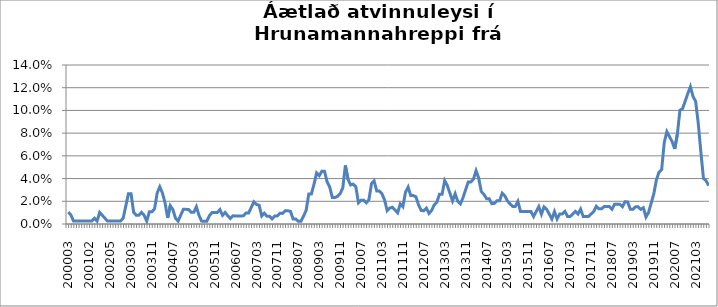
| Category | Series 0 |
|---|---|
| 200003 | 0.011 |
| 200004 | 0.008 |
| 200005 | 0.003 |
| 200007 | 0.003 |
| 200008 | 0.003 |
| 200011 | 0.003 |
| 200012 | 0.003 |
| 200101 | 0.003 |
| 200102 | 0.003 |
| 200103 | 0.003 |
| 200111 | 0.005 |
| 200112 | 0.003 |
| 200201 | 0.01 |
| 200202 | 0.008 |
| 200203 | 0.005 |
| 200204 | 0.003 |
| 200205 | 0.003 |
| 200206 | 0.003 |
| 200207 | 0.003 |
| 200208 | 0.003 |
| 200211 | 0.003 |
| 200212 | 0.005 |
| 200301 | 0.016 |
| 200302 | 0.027 |
| 200303 | 0.027 |
| 200304 | 0.01 |
| 200305 | 0.008 |
| 200306 | 0.008 |
| 200307 | 0.01 |
| 200308 | 0.008 |
| 200309 | 0.003 |
| 200310 | 0.011 |
| 200311 | 0.011 |
| 200312 | 0.013 |
| 200401 | 0.027 |
| 200402 | 0.033 |
| 200403 | 0.027 |
| 200404 | 0.019 |
| 200405 | 0.005 |
| 200406 | 0.016 |
| 200407 | 0.013 |
| 200408 | 0.005 |
| 200409 | 0.003 |
| 200410 | 0.008 |
| 200411 | 0.013 |
| 200412 | 0.013 |
| 200501 | 0.013 |
| 200502 | 0.01 |
| 200503 | 0.01 |
| 200504 | 0.015 |
| 200505 | 0.008 |
| 200506 | 0.003 |
| 200507 | 0.002 |
| 200508 | 0.002 |
| 200509 | 0.007 |
| 200510 | 0.01 |
| 200511 | 0.01 |
| 200512 | 0.01 |
| 200601 | 0.013 |
| 200602 | 0.008 |
| 200603 | 0.01 |
| 200604 | 0.007 |
| 200605 | 0.005 |
| 200606 | 0.007 |
| 200607 | 0.007 |
| 200608 | 0.007 |
| 200609 | 0.007 |
| 200610 | 0.007 |
| 200611 | 0.01 |
| 200612 | 0.01 |
| 200701 | 0.015 |
| 200702 | 0.02 |
| 200703 | 0.017 |
| 200704 | 0.017 |
| 200705 | 0.007 |
| 200706 | 0.009 |
| 200707 | 0.007 |
| 200708 | 0.007 |
| 200709 | 0.005 |
| 200710 | 0.007 |
| 200711 | 0.007 |
| 200712 | 0.009 |
| 200801 | 0.009 |
| 200802 | 0.012 |
| 200803 | 0.012 |
| 200804 | 0.011 |
| 200805 | 0.004 |
| 200806 | 0.004 |
| 200807 | 0.002 |
| 200808 | 0.002 |
| 200809 | 0.007 |
| 200810 | 0.012 |
| 200811 | 0.027 |
| 200812 | 0.027 |
| 200901 | 0.035 |
| 200902 | 0.045 |
| 200903 | 0.042 |
| 200904 | 0.047 |
| 200905 | 0.047 |
| 200906 | 0.037 |
| 200907 | 0.033 |
| 200908 | 0.023 |
| 200909 | 0.023 |
| 200910 | 0.024 |
| 200911 | 0.027 |
| 200912 | 0.032 |
| 201001 | 0.052 |
| 201002 | 0.039 |
| 201003 | 0.034 |
| 201004 | 0.035 |
| 201005 | 0.033 |
| 201006 | 0.019 |
| 201007 | 0.021 |
| 201008 | 0.021 |
| 201009 | 0.019 |
| 201010 | 0.021 |
| 201011 | 0.036 |
| 201012 | 0.038 |
| 201101 | 0.029 |
| 201102 | 0.029 |
| 201103 | 0.027 |
| 201104 | 0.021 |
| 201105 | 0.012 |
| 201106 | 0.014 |
| 201107 | 0.015 |
| 201108 | 0.012 |
| 201109 | 0.01 |
| 201110 | 0.018 |
| 201111 | 0.015 |
| 201112 | 0.028 |
| 201201 | 0.032 |
| 201202 | 0.025 |
| 201203 | 0.025 |
| 201204 | 0.024 |
| 201205 | 0.017 |
| 201206 | 0.012 |
| 201207 | 0.012 |
| 201208 | 0.014 |
| 201209 | 0.009 |
| 201210 | 0.012 |
| 201211 | 0.017 |
| 201212 | 0.019 |
| 201301 | 0.026 |
| 201302 | 0.026 |
| 201303 | 0.038 |
| 201304 | 0.034 |
| 201305 | 0.027 |
| 201306 | 0.02 |
| 201307 | 0.027 |
| 201308 | 0.02 |
| 201309 | 0.018 |
| 201310 | 0.023 |
| 201311 | 0.03 |
| 201312 | 0.037 |
| 201401 | 0.037 |
| 201402 | 0.04 |
| 201403 | 0.047 |
| 201404 | 0.04 |
| 201405 | 0.029 |
| 201406 | 0.026 |
| 201407 | 0.022 |
| 201408 | 0.022 |
| 201409 | 0.018 |
| 201410 | 0.018 |
| 201411 | 0.02 |
| 201412 | 0.02 |
| 201501 | 0.027 |
| 201502 | 0.025 |
| 201503 | 0.02 |
| 201504 | 0.018 |
| 201505 | 0.015 |
| 201506 | 0.015 |
| 201507 | 0.02 |
| 201508 | 0.011 |
| 201509 | 0.011 |
| 201510 | 0.011 |
| 201511 | 0.011 |
| 201512 | 0.011 |
| 201601 | 0.007 |
| 201602 | 0.011 |
| 201603 | 0.015 |
| 201604 | 0.009 |
| 201605 | 0.015 |
| 201606 | 0.013 |
| 201607 | 0.009 |
| 201608 | 0.004 |
| 201609 | 0.011 |
| 201610 | 0.004 |
| 201611 | 0.009 |
| 201612 | 0.009 |
| 201701 | 0.011 |
| 201702 | 0.007 |
| 201703 | 0.007 |
| 201704 | 0.009 |
| 201705 | 0.011 |
| 201706 | 0.009 |
| 201707 | 0.013 |
| 201708 | 0.007 |
| 201709 | 0.007 |
| 201710 | 0.007 |
| 201711 | 0.009 |
| 201712 | 0.011 |
| 201801 | 0.016 |
| 201802 | 0.013 |
| 201803 | 0.013 |
| 201804 | 0.015 |
| 201805 | 0.015 |
| 201806 | 0.015 |
| 201807 | 0.013 |
| 201808 | 0.017 |
| 201809 | 0.017 |
| 201810 | 0.017 |
| 201811 | 0.015 |
| 201812 | 0.02 |
| 201901 | 0.019 |
| 201902 | 0.013 |
| 201903 | 0.013 |
| 201904 | 0.015 |
| 201905 | 0.015 |
| 201906 | 0.013 |
| 201907 | 0.014 |
| 201908 | 0.006 |
| 201909 | 0.01 |
| 201910 | 0.018 |
| 201911 | 0.027 |
| 201912 | 0.039 |
| 202001 | 0.046 |
| 202002 | 0.048 |
| 202003 | 0.072 |
| 202004 | 0.081 |
| 202005 | 0.077 |
| 202006 | 0.073 |
| 202007 | 0.066 |
| 202008 | 0.079 |
| 202009 | 0.1 |
| 202010 | 0.102 |
| 202011 | 0.108 |
| 202012 | 0.115 |
| 202101 | 0.121 |
| 202102 | 0.112 |
| 202103 | 0.108 |
| 202104 | 0.089 |
| 202105 | 0.063 |
| 202106 | 0.04 |
| 202107 | 0.038 |
| 202108 | 0.034 |